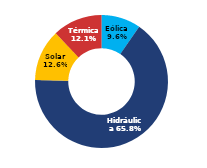
| Category | Sur |
|---|---|
| Eólica | 56.167 |
| Hidráulica | 385.463 |
| Solar | 73.566 |
| Térmica | 70.838 |